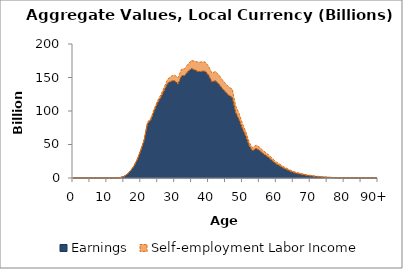
| Category | Earnings | Self-employment Labor Income |
|---|---|---|
| 0 | 0 | 0 |
|  | 0 | 0 |
| 2 | 0 | 0 |
| 3 | 0 | 0 |
| 4 | 0 | 0 |
| 5 | 0 | 0 |
| 6 | 0 | 0 |
| 7 | 0 | 0 |
| 8 | 0 | 0 |
| 9 | 0 | 0 |
| 10 | 0 | 0 |
| 11 | 1.152 | 0 |
| 12 | 29.5 | 0 |
| 13 | 157.979 | 3.44 |
| 14 | 755.726 | 13.838 |
| 15 | 2206.439 | 64.29 |
| 16 | 5402.518 | 153.671 |
| 17 | 10839.178 | 295.697 |
| 18 | 17564.846 | 468.964 |
| 19 | 27703.785 | 698.722 |
| 20 | 40894.559 | 1144.258 |
| 21 | 56101.908 | 1569.5 |
| 22 | 81311.34 | 2222.196 |
| 23 | 86865.505 | 2466.643 |
| 24 | 100635.965 | 2838.702 |
| 25 | 112592.669 | 3213.484 |
| 26 | 120877.271 | 3874.652 |
| 27 | 131727.793 | 4898.774 |
| 28 | 141650.657 | 6102.598 |
| 29 | 144590.479 | 7381.365 |
| 30 | 145155.974 | 8495.67 |
| 31 | 140476.451 | 8910.111 |
| 32 | 152183.133 | 10058.969 |
| 33 | 153164.425 | 10106.264 |
| 34 | 159422.32 | 10928.819 |
| 35 | 163299.391 | 12067.279 |
| 36 | 161073.998 | 13059.74 |
| 37 | 158606.38 | 14129.671 |
| 38 | 159233 | 14100.066 |
| 39 | 159412.164 | 13754.864 |
| 40 | 153384.64 | 13456.06 |
| 41 | 143429.57 | 13061.68 |
| 42 | 145097.885 | 13738.644 |
| 43 | 140498.843 | 13662.552 |
| 44 | 133770.262 | 13052.524 |
| 45 | 128390.359 | 12636.918 |
| 46 | 123255.861 | 12386.858 |
| 47 | 120288.346 | 12279.501 |
| 48 | 97721.553 | 10039.33 |
| 49 | 87157.654 | 8971.328 |
| 50 | 73686.044 | 7551.001 |
| 51 | 62396.929 | 6467.83 |
| 52 | 47913.348 | 5122.151 |
| 53 | 40584.201 | 4455.182 |
| 54 | 44191.095 | 4961.733 |
| 55 | 41381.154 | 4774.083 |
| 56 | 36906.536 | 4405.679 |
| 57 | 33325.301 | 4159.474 |
| 58 | 29460.328 | 3817.654 |
| 59 | 24908.788 | 3303.737 |
| 60 | 20920.375 | 2802.864 |
| 61 | 18268.378 | 2526.217 |
| 62 | 14962.312 | 2191.656 |
| 63 | 12661.428 | 1998.604 |
| 64 | 10291.518 | 1768.034 |
| 65 | 8261.04 | 1546.344 |
| 66 | 6819.525 | 1396.71 |
| 67 | 5726.038 | 1279.463 |
| 68 | 4777.072 | 1130.536 |
| 69 | 3806.773 | 948.545 |
| 70 | 3195.1 | 811.914 |
| 71 | 2523.036 | 679.885 |
| 72 | 2034.251 | 569.886 |
| 73 | 1564.732 | 438.846 |
| 74 | 1169.554 | 318.336 |
| 75 | 933.294 | 235.306 |
| 76 | 797.643 | 183.26 |
| 77 | 652.133 | 133.968 |
| 78 | 477.611 | 85.061 |
| 79 | 357.844 | 53.41 |
| 80 | 283.853 | 33.396 |
| 81 | 236.472 | 22.563 |
| 82 | 176.406 | 13.326 |
| 83 | 143.282 | 7.185 |
| 84 | 120.896 | 2.334 |
| 85 | 93.568 | 0 |
| 86 | 76.855 | 0 |
| 87 | 46.981 | 0 |
| 88 | 32.497 | 0 |
| 89 | 21.523 | 0 |
| 90+ | 48.553 | 0 |